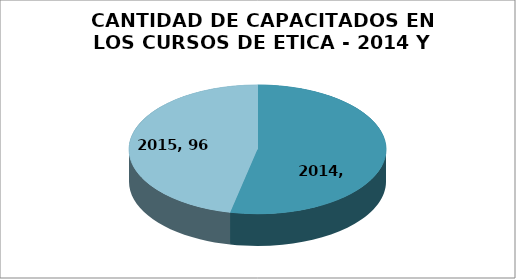
| Category | Series 1 |
|---|---|
| 0 | 110 |
| 1 | 96 |